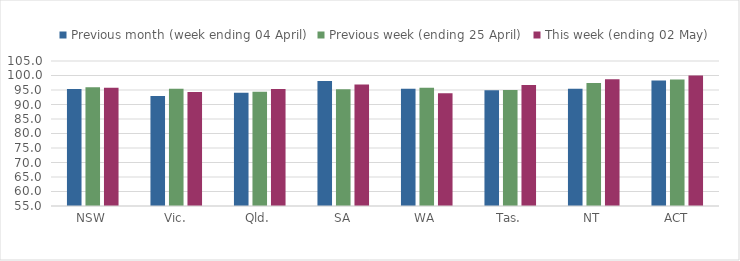
| Category | Previous month (week ending 04 April) | Previous week (ending 25 April) | This week (ending 02 May) |
|---|---|---|---|
| NSW | 95.372 | 95.991 | 95.814 |
| Vic. | 92.969 | 95.416 | 94.326 |
| Qld. | 94.011 | 94.378 | 95.36 |
| SA | 98.135 | 95.227 | 96.918 |
| WA | 95.406 | 95.792 | 93.883 |
| Tas. | 94.877 | 95.009 | 96.728 |
| NT | 95.395 | 97.415 | 98.688 |
| ACT | 98.307 | 98.581 | 99.959 |